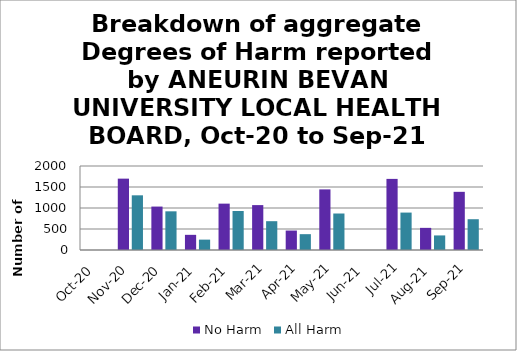
| Category | No Harm | All Harm |
|---|---|---|
| Oct-20 | 0 | 0 |
| Nov-20 | 1699 | 1302 |
| Dec-20 | 1034 | 921 |
| Jan-21 | 361 | 247 |
| Feb-21 | 1104 | 929 |
| Mar-21 | 1069 | 686 |
| Apr-21 | 463 | 377 |
| May-21 | 1443 | 869 |
| Jun-21 | 0 | 0 |
| Jul-21 | 1693 | 891 |
| Aug-21 | 527 | 347 |
| Sep-21 | 1385 | 733 |